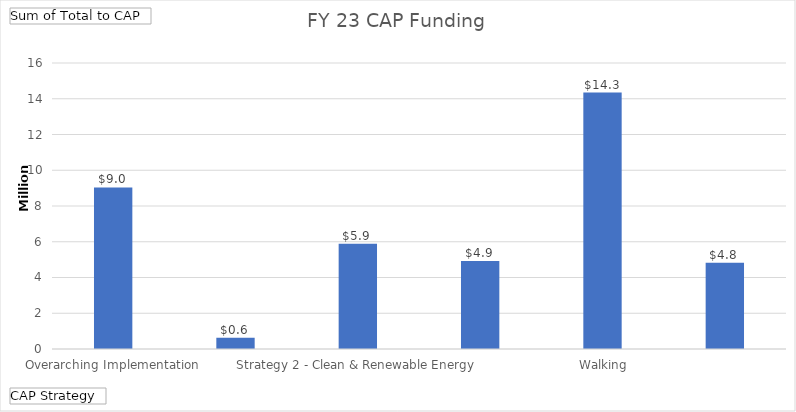
| Category | Total |
|---|---|
| Overarching Implementation | 9035367 |
| Strategy 1 - Energy & Water Efficient  Buildings | 626500 |
| Strategy 2 - Clean & Renewable Energy | 5891933.6 |
| Strategy 3 - Bicycling, Walking, Transit, and Land Use  | 4918258.8 |
| Strategy 4 - Zero Waste | 14342742 |
| Strategy 5 - Climate Resiliency | 4828914.6 |